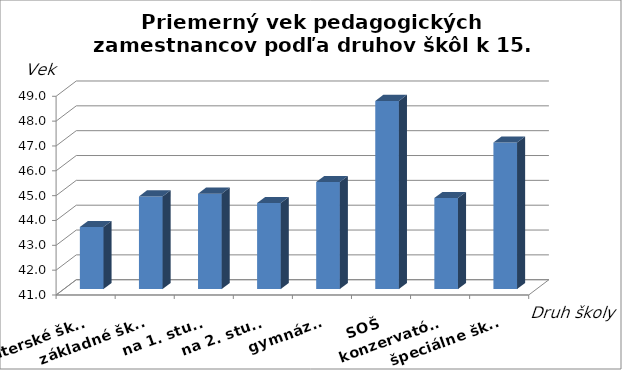
| Category | Series 0 |
|---|---|
| materské školy | 43.494 |
| základné školy | 44.729 |
| na 1. stupni | 44.839 |
| na 2. stupni | 44.463 |
| gymnáziá | 45.309 |
| SOŠ | 48.575 |
| konzervatóriá | 44.663 |
| špeciálne školy | 46.9 |